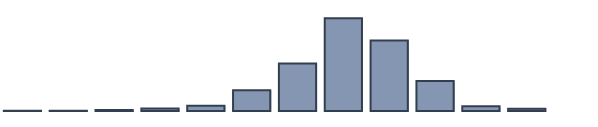
| Category | Series 0 |
|---|---|
| 0 | 0.087 |
| 1 | 0.087 |
| 2 | 0.391 |
| 3 | 0.87 |
| 4 | 1.87 |
| 5 | 7.478 |
| 6 | 17.087 |
| 7 | 33.435 |
| 8 | 25.435 |
| 9 | 10.783 |
| 10 | 1.696 |
| 11 | 0.783 |
| 12 | 0 |